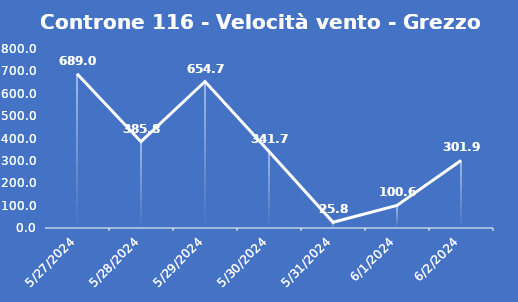
| Category | Controne 116 - Velocità vento - Grezzo (min) |
|---|---|
| 5/27/24 | 689 |
| 5/28/24 | 385.8 |
| 5/29/24 | 654.7 |
| 5/30/24 | 341.7 |
| 5/31/24 | 25.8 |
| 6/1/24 | 100.6 |
| 6/2/24 | 301.9 |